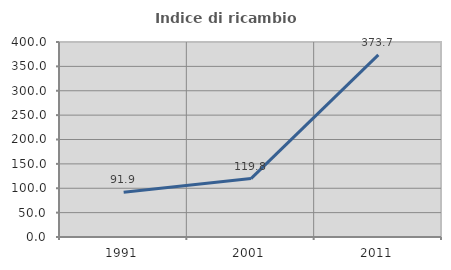
| Category | Indice di ricambio occupazionale  |
|---|---|
| 1991.0 | 91.892 |
| 2001.0 | 119.78 |
| 2011.0 | 373.684 |